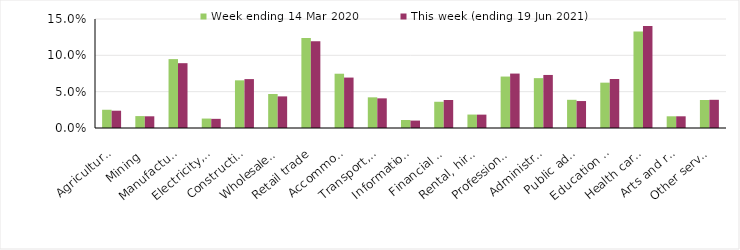
| Category | Week ending 14 Mar 2020 | This week (ending 19 Jun 2021) |
|---|---|---|
| Agriculture, forestry and fishing | 0.025 | 0.024 |
| Mining | 0.016 | 0.016 |
| Manufacturing | 0.095 | 0.089 |
| Electricity, gas, water and waste services | 0.013 | 0.013 |
| Construction | 0.066 | 0.067 |
| Wholesale trade | 0.047 | 0.044 |
| Retail trade | 0.124 | 0.119 |
| Accommodation and food services | 0.075 | 0.069 |
| Transport, postal and warehousing | 0.042 | 0.041 |
| Information media and telecommunications | 0.011 | 0.01 |
| Financial and insurance services | 0.036 | 0.038 |
| Rental, hiring and real estate services | 0.018 | 0.018 |
| Professional, scientific and technical services | 0.071 | 0.075 |
| Administrative and support services | 0.069 | 0.073 |
| Public administration and safety | 0.039 | 0.037 |
| Education and training | 0.062 | 0.067 |
| Health care and social assistance | 0.133 | 0.14 |
| Arts and recreation services | 0.016 | 0.016 |
| Other services | 0.038 | 0.039 |